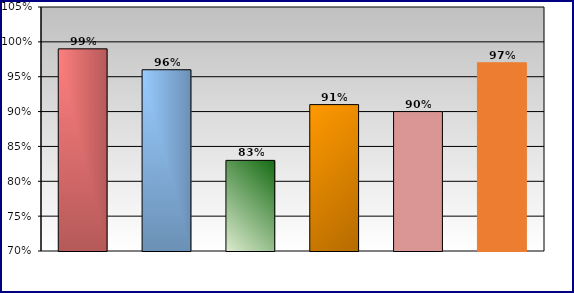
| Category | Series 0 |
|---|---|
| 0 | 0.99 |
| 1 | 0.96 |
| 2 | 0.83 |
| 3 | 0.91 |
| 4 | 0.9 |
| 5 | 0.97 |